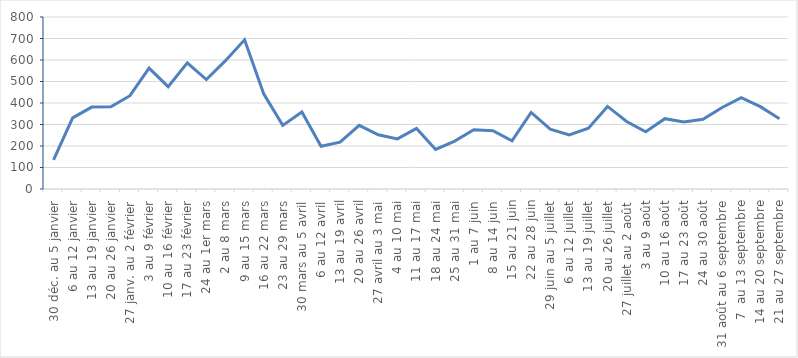
| Category | 2020 |
|---|---|
| 30 déc. au 5 janvier | 136 |
| 6 au 12 janvier | 331 |
| 13 au 19 janvier | 381 |
| 20 au 26 janvier | 382 |
| 27 janv. au 2 février | 434 |
| 3 au 9 février | 562 |
| 10 au 16 février | 476 |
| 17 au 23 février | 587 |
| 24 au 1er mars | 509 |
| 2 au 8 mars | 597 |
| 9 au 15 mars | 694 |
| 16 au 22 mars | 443 |
| 23 au 29 mars | 296 |
| 30 mars au 5 avril | 358 |
| 6 au 12 avril | 199 |
| 13 au 19 avril | 218 |
| 20 au 26 avril | 296 |
| 27 avril au 3 mai | 252 |
| 4 au 10 mai | 233 |
| 11 au 17 mai | 282 |
| 18 au 24 mai | 184 |
| 25 au 31 mai | 223 |
| 1 au 7 juin | 276 |
| 8 au 14 juin | 271 |
| 15 au 21 juin | 224 |
| 22 au 28 juin | 356 |
| 29 juin au 5 juillet | 278 |
| 6 au 12 juillet | 252 |
| 13 au 19 juillet | 283 |
| 20 au 26 juillet | 384 |
| 27 juillet au 2 août | 314 |
| 3 au 9 août | 266 |
| 10 au 16 août | 327 |
| 17 au 23 août | 312 |
| 24 au 30 août | 324 |
| 31 août au 6 septembre | 379 |
| 7  au 13 septembre | 425 |
| 14 au 20 septembre | 383 |
| 21 au 27 septembre | 327 |